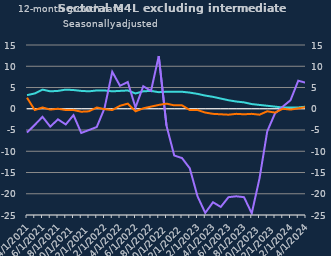
| Category | zero | Households | Non-intermediate OFCs |
|---|---|---|---|
| Apr-2021 | 0 | 3.2 | -5.6 |
| May-2021 | 0 | 3.6 | -3.8 |
| Jun-2021 | 0 | 4.5 | -1.9 |
| Jul-2021 | 0 | 4.1 | -4.2 |
| Aug-2021 | 0 | 4.2 | -2.5 |
| Sep-2021 | 0 | 4.5 | -3.7 |
| Oct-2021 | 0 | 4.4 | -1.5 |
| Nov-2021 | 0 | 4.2 | -5.7 |
| Dec-2021 | 0 | 4.1 | -5 |
| Jan-2022 | 0 | 4.3 | -4.3 |
| Feb-2022 | 0 | 4.3 | 0.1 |
| Mar-2022 | 0 | 4.1 | 8.7 |
| Apr-2022 | 0 | 4.2 | 5.4 |
| May-2022 | 0 | 4.3 | 6.3 |
| Jun-2022 | 0 | 3.6 | 0.3 |
| Jul-2022 | 0 | 4.1 | 5.3 |
| Aug-2022 | 0 | 4.2 | 4.2 |
| Sep-2022 | 0 | 3.9 | 12.4 |
| Oct-2022 | 0 | 4 | -4 |
| Nov-2022 | 0 | 4 | -11 |
| Dec-2022 | 0 | 4 | -11.6 |
| Jan-2023 | 0 | 3.8 | -14 |
| Feb-2023 | 0 | 3.5 | -20.6 |
| Mar-2023 | 0 | 3.1 | -24.5 |
| Apr-2023 | 0 | 2.8 | -22 |
| May-2023 | 0 | 2.4 | -23.1 |
| Jun-2023 | 0 | 2 | -20.8 |
| Jul-2023 | 0 | 1.7 | -20.6 |
| Aug-2023 | 0 | 1.5 | -20.8 |
| Sep-2023 | 0 | 1.1 | -24.6 |
| Oct-2023 | 0 | 0.9 | -16.4 |
| Nov-2023 | 0 | 0.7 | -5.3 |
| Dec-2023 | 0 | 0.5 | -1.1 |
| Jan-2024 | 0 | 0.3 | 0.5 |
| Feb-2024 | 0 | 0.3 | 2 |
| Mar-2024 | 0 | 0.3 | 6.6 |
| Apr-2024 | 0 | 0.5 | 6.1 |